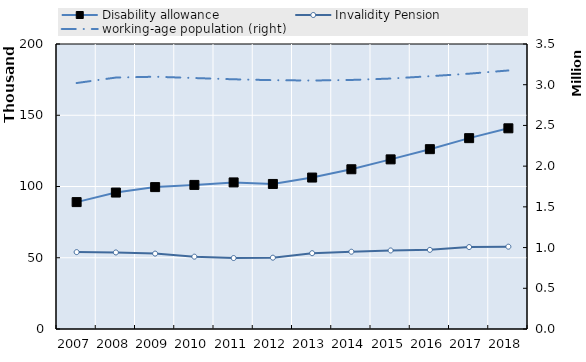
| Category | Disability allowance | Invalidity Pension |
|---|---|---|
| 2007.0 | 89048 | 53956 |
| 2008.0 | 95754 | 53725 |
| 2009.0 | 99576 | 52922 |
| 2010.0 | 101111 | 50766 |
| 2011.0 | 102866 | 49792 |
| 2012.0 | 101784 | 50053 |
| 2013.0 | 106279 | 53196 |
| 2014.0 | 112097 | 54223 |
| 2015.0 | 119042 | 55115 |
| 2016.0 | 126203 | 55532 |
| 2017.0 | 133929 | 57504 |
| 2018.0 | 140835 | 57768 |